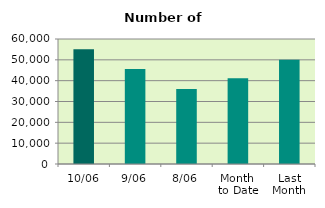
| Category | Series 0 |
|---|---|
| 10/06 | 55074 |
| 9/06 | 45586 |
| 8/06 | 36044 |
| Month 
to Date | 41157.5 |
| Last
Month | 50099.545 |